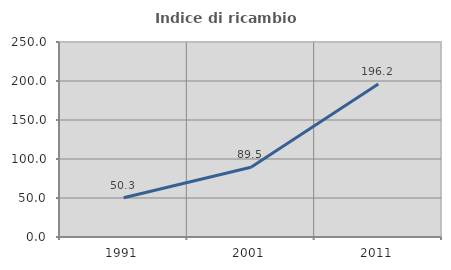
| Category | Indice di ricambio occupazionale  |
|---|---|
| 1991.0 | 50.258 |
| 2001.0 | 89.499 |
| 2011.0 | 196.23 |